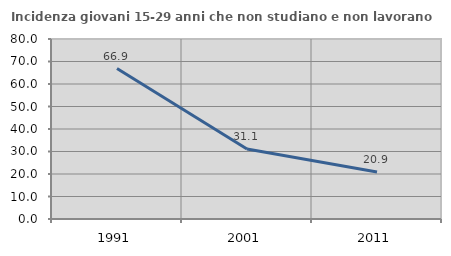
| Category | Incidenza giovani 15-29 anni che non studiano e non lavorano  |
|---|---|
| 1991.0 | 66.857 |
| 2001.0 | 31.081 |
| 2011.0 | 20.853 |